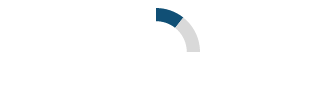
| Category | Series 0 |
|---|---|
| 0 | 0.107 |
| 1 | 0.143 |
| 2 | 0.75 |